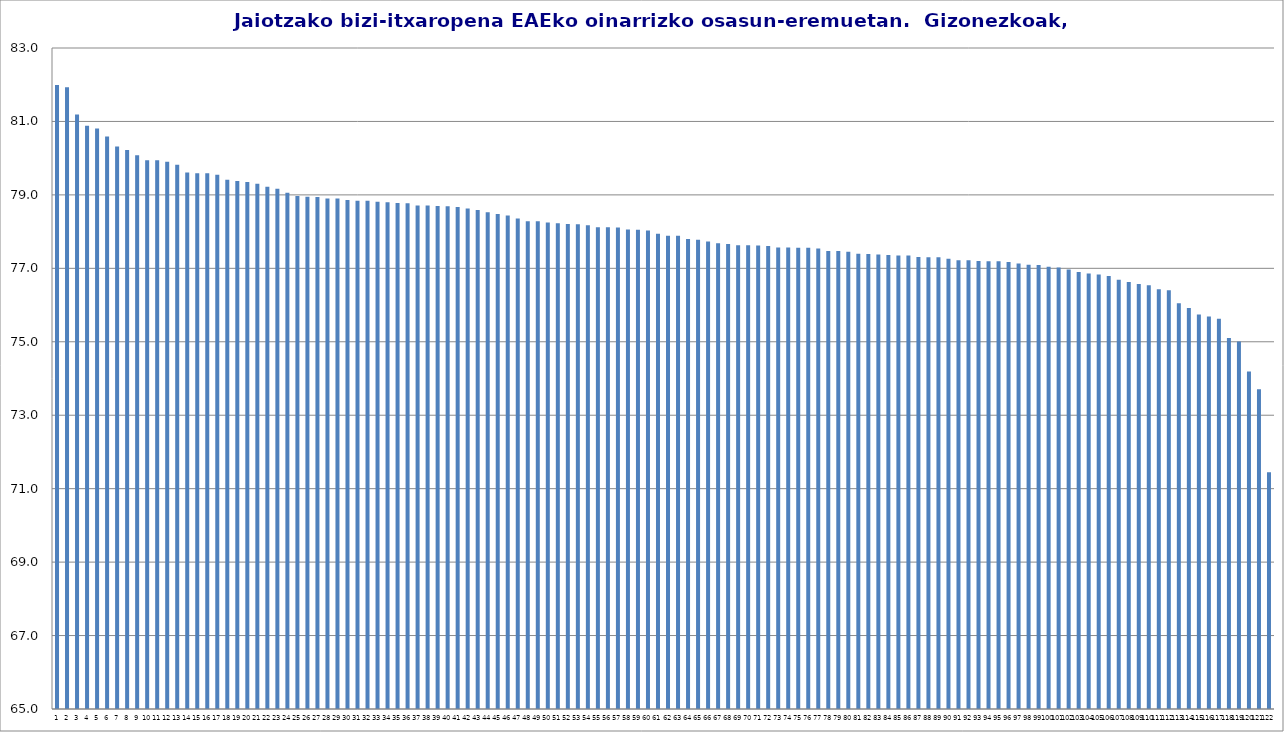
| Category | Series 0 |
|---|---|
| 0 | 81.99 |
| 1 | 81.93 |
| 2 | 81.19 |
| 3 | 80.88 |
| 4 | 80.81 |
| 5 | 80.59 |
| 6 | 80.32 |
| 7 | 80.22 |
| 8 | 80.08 |
| 9 | 79.94 |
| 10 | 79.94 |
| 11 | 79.9 |
| 12 | 79.82 |
| 13 | 79.61 |
| 14 | 79.59 |
| 15 | 79.59 |
| 16 | 79.55 |
| 17 | 79.41 |
| 18 | 79.38 |
| 19 | 79.35 |
| 20 | 79.3 |
| 21 | 79.22 |
| 22 | 79.17 |
| 23 | 79.06 |
| 24 | 78.97 |
| 25 | 78.95 |
| 26 | 78.94 |
| 27 | 78.9 |
| 28 | 78.9 |
| 29 | 78.86 |
| 30 | 78.84 |
| 31 | 78.84 |
| 32 | 78.81 |
| 33 | 78.8 |
| 34 | 78.78 |
| 35 | 78.77 |
| 36 | 78.71 |
| 37 | 78.71 |
| 38 | 78.7 |
| 39 | 78.69 |
| 40 | 78.67 |
| 41 | 78.63 |
| 42 | 78.59 |
| 43 | 78.53 |
| 44 | 78.48 |
| 45 | 78.44 |
| 46 | 78.36 |
| 47 | 78.28 |
| 48 | 78.28 |
| 49 | 78.25 |
| 50 | 78.23 |
| 51 | 78.21 |
| 52 | 78.2 |
| 53 | 78.17 |
| 54 | 78.12 |
| 55 | 78.12 |
| 56 | 78.11 |
| 57 | 78.06 |
| 58 | 78.05 |
| 59 | 78.03 |
| 60 | 77.94 |
| 61 | 77.89 |
| 62 | 77.89 |
| 63 | 77.8 |
| 64 | 77.78 |
| 65 | 77.73 |
| 66 | 77.68 |
| 67 | 77.66 |
| 68 | 77.63 |
| 69 | 77.63 |
| 70 | 77.62 |
| 71 | 77.61 |
| 72 | 77.57 |
| 73 | 77.57 |
| 74 | 77.56 |
| 75 | 77.56 |
| 76 | 77.54 |
| 77 | 77.47 |
| 78 | 77.47 |
| 79 | 77.45 |
| 80 | 77.4 |
| 81 | 77.39 |
| 82 | 77.38 |
| 83 | 77.36 |
| 84 | 77.35 |
| 85 | 77.35 |
| 86 | 77.31 |
| 87 | 77.3 |
| 88 | 77.3 |
| 89 | 77.26 |
| 90 | 77.22 |
| 91 | 77.22 |
| 92 | 77.2 |
| 93 | 77.19 |
| 94 | 77.19 |
| 95 | 77.17 |
| 96 | 77.13 |
| 97 | 77.1 |
| 98 | 77.09 |
| 99 | 77.04 |
| 100 | 77.02 |
| 101 | 76.97 |
| 102 | 76.9 |
| 103 | 76.86 |
| 104 | 76.83 |
| 105 | 76.79 |
| 106 | 76.69 |
| 107 | 76.63 |
| 108 | 76.57 |
| 109 | 76.54 |
| 110 | 76.43 |
| 111 | 76.4 |
| 112 | 76.05 |
| 113 | 75.92 |
| 114 | 75.74 |
| 115 | 75.69 |
| 116 | 75.63 |
| 117 | 75.1 |
| 118 | 75.01 |
| 119 | 74.19 |
| 120 | 73.71 |
| 121 | 71.45 |